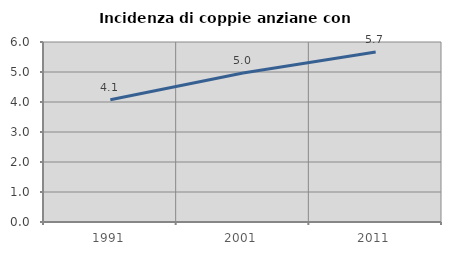
| Category | Incidenza di coppie anziane con figli |
|---|---|
| 1991.0 | 4.077 |
| 2001.0 | 4.966 |
| 2011.0 | 5.67 |